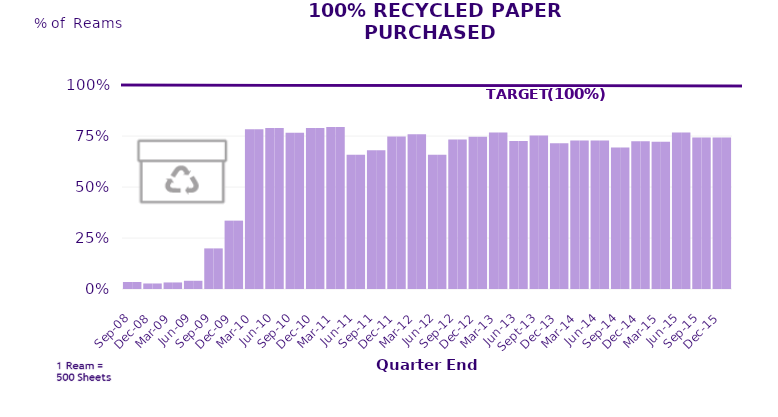
| Category | Series 0 | Series 1 |
|---|---|---|
| Sep-08 | 0.034 | 0.034 |
| Dec-08 | 0.027 | 0.027 |
| Mar-09 | 0.032 | 0.032 |
| Jun-09 | 0.04 | 0.04 |
| Sep-09 | 0.199 | 0.199 |
| Dec-09 | 0.335 | 0.335 |
| Mar-10 | 0.783 | 0.783 |
| Jun-10 | 0.789 | 0.789 |
| Sep-10 | 0.766 | 0.766 |
| Dec-10 | 0.789 | 0.789 |
| Mar-11 | 0.794 | 0.794 |
| Jun-11 | 0.659 | 0.659 |
| Sep-11 | 0.68 | 0.68 |
| Dec-11 | 0.748 | 0.748 |
| Mar-12 | 0.759 | 0.759 |
| Jun-12 | 0.659 | 0.659 |
| Sep-12 | 0.732 | 0.732 |
| Dec-12 | 0.746 | 0.746 |
| Mar-13 | 0.767 | 0.767 |
| Jun-13 | 0.726 | 0.726 |
| Sep-13 | 0.752 | 0.752 |
| Dec-13 | 0.714 | 0.714 |
| Mar-14 | 0.728 | 0.728 |
| Jun-14 | 0.728 | 0.728 |
| Sep-14 | 0.693 | 0.693 |
| Dec-14 | 0.724 | 0.724 |
| Mar-15 | 0.721 | 0.721 |
| Jun-15 | 0.767 | 0.767 |
| Sep-15 | 0.742 | 0.742 |
| Dec-15 | 0.743 | 0.743 |